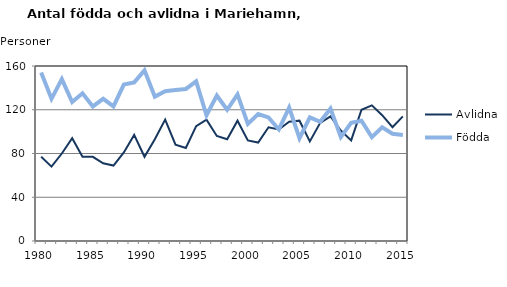
| Category | Avlidna | Födda |
|---|---|---|
| 1980.0 | 77 | 154 |
| 1981.0 | 68 | 130 |
| 1982.0 | 80 | 148 |
| 1983.0 | 94 | 127 |
| 1984.0 | 77 | 135 |
| 1985.0 | 77 | 123 |
| 1986.0 | 71 | 130 |
| 1987.0 | 69 | 123 |
| 1988.0 | 81 | 143 |
| 1989.0 | 97 | 145 |
| 1990.0 | 77 | 156 |
| 1991.0 | 93 | 132 |
| 1992.0 | 111 | 137 |
| 1993.0 | 88 | 138 |
| 1994.0 | 85 | 139 |
| 1995.0 | 105 | 146 |
| 1996.0 | 111 | 115 |
| 1997.0 | 96 | 133 |
| 1998.0 | 93 | 120 |
| 1999.0 | 110 | 134 |
| 2000.0 | 92 | 107 |
| 2001.0 | 90 | 116 |
| 2002.0 | 104 | 113 |
| 2003.0 | 102 | 102 |
| 2004.0 | 109 | 122 |
| 2005.0 | 110 | 94 |
| 2006.0 | 91 | 113 |
| 2007.0 | 108 | 109 |
| 2008.0 | 114 | 121 |
| 2009.0 | 101 | 95 |
| 2010.0 | 92 | 108 |
| 2011.0 | 120 | 110 |
| 2012.0 | 124 | 95 |
| 2013.0 | 115 | 104 |
| 2014.0 | 104 | 98 |
| 2015.0 | 114 | 97 |